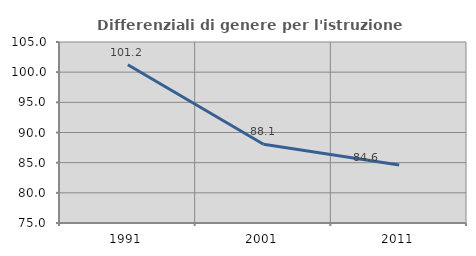
| Category | Differenziali di genere per l'istruzione superiore |
|---|---|
| 1991.0 | 101.235 |
| 2001.0 | 88.054 |
| 2011.0 | 84.615 |